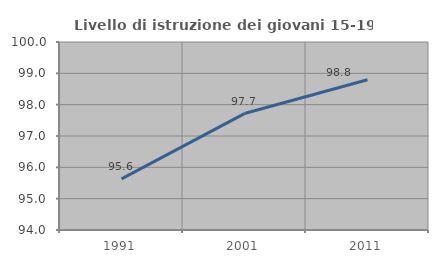
| Category | Livello di istruzione dei giovani 15-19 anni |
|---|---|
| 1991.0 | 95.63 |
| 2001.0 | 97.716 |
| 2011.0 | 98.795 |